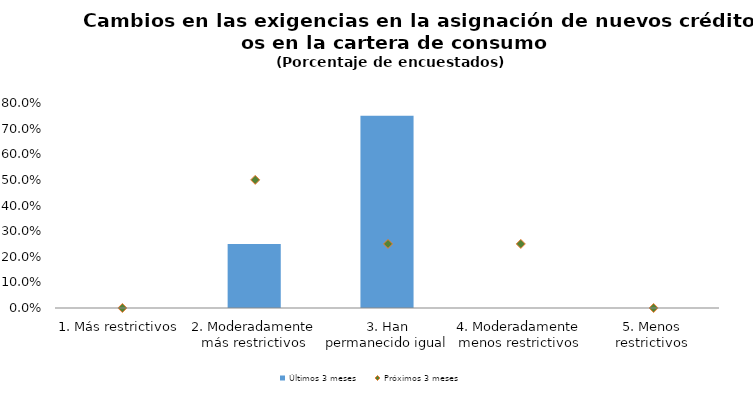
| Category | Últimos 3 meses |
|---|---|
| 1. Más restrictivos | 0 |
| 2. Moderadamente más restrictivos | 0.25 |
| 3. Han permanecido igual | 0.75 |
| 4. Moderadamente menos restrictivos | 0 |
| 5. Menos restrictivos | 0 |